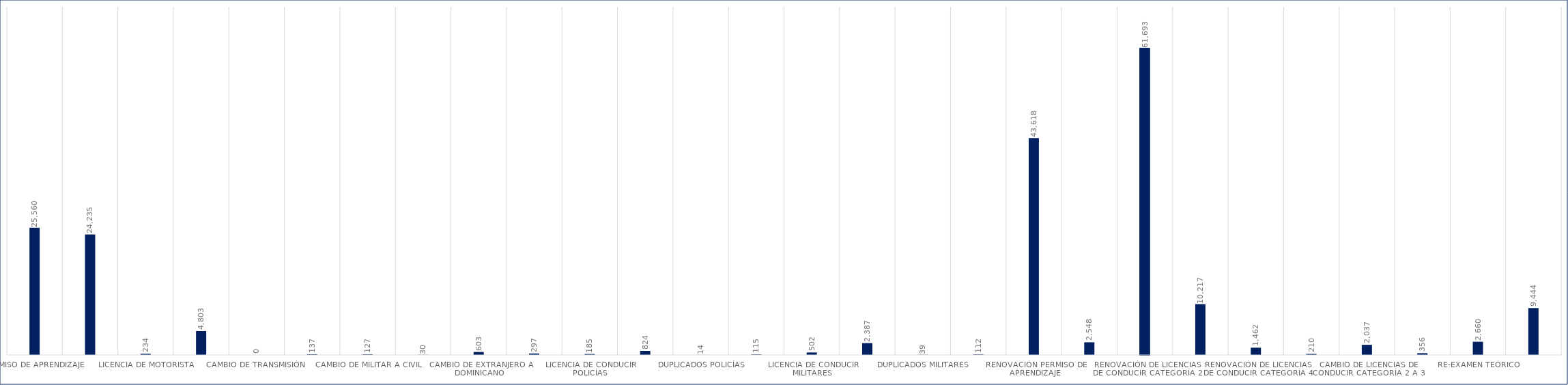
| Category | Series 0 |
|---|---|
| Permiso de Aprendizaje  | 25560 |
| Licencia de  Conducir  | 24235 |
| Licencia de Motorista | 234 |
| Duplicados  | 4803 |
| Cambio de Transmisión  | 0 |
| Cambio de Oficial a Civil | 137 |
| Cambio de Militar a Civil | 127 |
| Emisión Licencia de Conducir Diplomática | 30 |
| Cambio de Extranjero a Dominicano | 603 |
| Licencia de Conducir Categoría 5 | 297 |
| Licencia de Conducir Policías | 185 |
| Renovación Policías | 824 |
| Duplicados Policías | 14 |
| Cambio de Categoría Policías | 115 |
| Licencia de Conducir Militares | 502 |
| Renovación Militares | 2387 |
| Duplicados Militares | 39 |
| Cambio de Categoría Militares | 112 |
| Renovación Permiso de Aprendizaje | 43618 |
| Renovación de Licencias de Conducir Categoría 1 | 2548 |
| Renovación de Licencias de Conducir Categoría 2 | 61693 |
| Renovación de Licencias de Conducir Categoría 3 | 10217 |
| Renovación de Licencias de Conducir Categoría 4 | 1462 |
| Renovación de Licencias de Conducir Categoría 5 | 210 |
| Cambio de Licencias de Conducir Categoría 2 a 3  | 2037 |
| Cambio de Licencias de Conducir Categoría 3 a 4 | 356 |
| Re-Examen Teórico | 2660 |
| Re-Examen Práctico | 9444 |